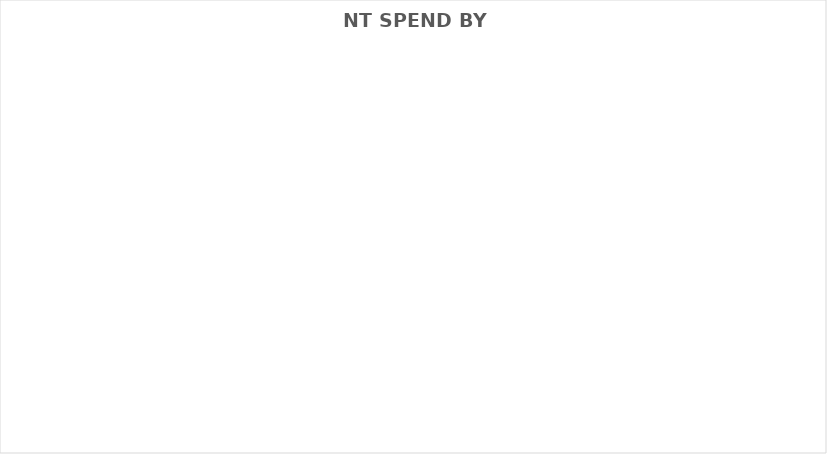
| Category | Series 0 |
|---|---|
| Above The Line | 0 |
| Crew Wages | 0 |
| Goods and Services | 0 |
| Post-Production | 0 |
| Other | 0 |